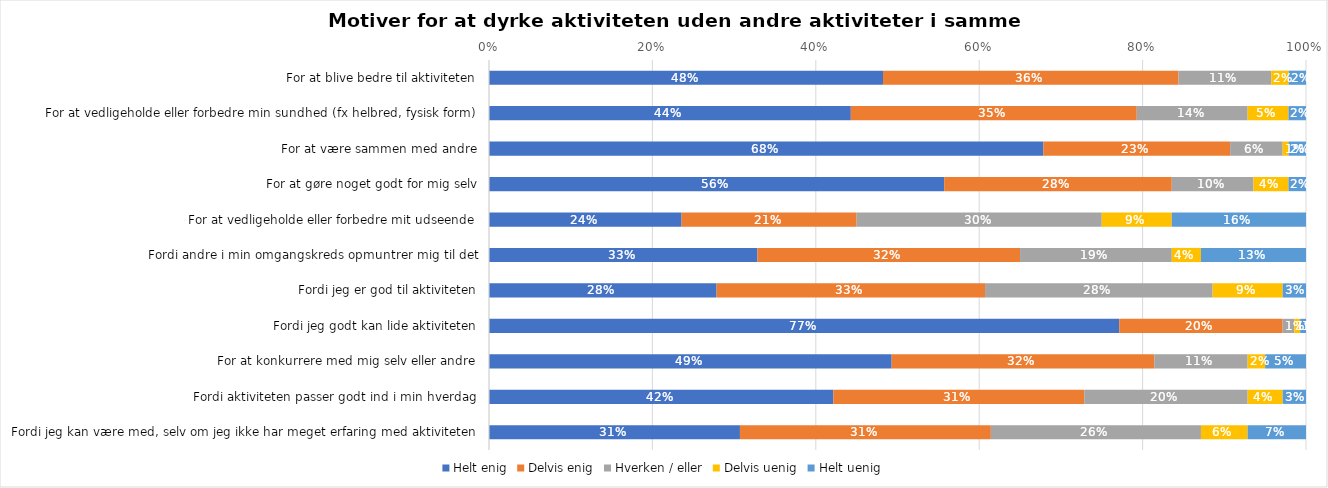
| Category | Helt enig | Delvis enig | Hverken / eller | Delvis uenig | Helt uenig |
|---|---|---|---|---|---|
| For at blive bedre til aktiviteten | 0.482 | 0.362 | 0.113 | 0.021 | 0.021 |
| For at vedligeholde eller forbedre min sundhed (fx helbred, fysisk form) | 0.443 | 0.35 | 0.136 | 0.05 | 0.021 |
| For at være sammen med andre | 0.679 | 0.229 | 0.064 | 0.007 | 0.021 |
| For at gøre noget godt for mig selv | 0.557 | 0.279 | 0.1 | 0.043 | 0.021 |
| For at vedligeholde eller forbedre mit udseende | 0.236 | 0.214 | 0.3 | 0.086 | 0.164 |
| Fordi andre i min omgangskreds opmuntrer mig til det | 0.329 | 0.321 | 0.186 | 0.036 | 0.129 |
| Fordi jeg er god til aktiviteten | 0.279 | 0.329 | 0.279 | 0.086 | 0.029 |
| Fordi jeg godt kan lide aktiviteten | 0.771 | 0.2 | 0.014 | 0.007 | 0.007 |
| For at konkurrere med mig selv eller andre | 0.493 | 0.321 | 0.114 | 0.021 | 0.05 |
| Fordi aktiviteten passer godt ind i min hverdag | 0.421 | 0.307 | 0.2 | 0.043 | 0.029 |
| Fordi jeg kan være med, selv om jeg ikke har meget erfaring med aktiviteten | 0.307 | 0.307 | 0.257 | 0.057 | 0.071 |